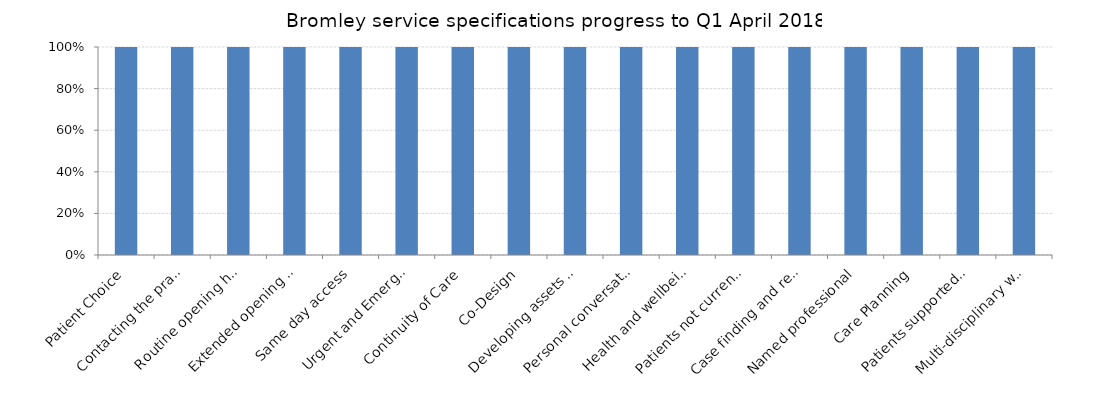
| Category | Series 0 |
|---|---|
| Patient Choice | 1 |
| Contacting the practice | 1 |
| Routine opening hours | 1 |
| Extended opening hours | 1 |
| Same day access | 1 |
| Urgent and Emergency Care | 1 |
| Continuity of Care | 1 |
| Co-Design | 1 |
| Developing assets and resources for improving health and wellbeing | 1 |
| Personal conversations focussed on an individual's health goals | 1 |
| Health and wellbeing liaison and information | 1 |
| Patients not currently accessing primary care services | 1 |
| Case finding and review | 1 |
| Named professional | 1 |
| Care Planning | 1 |
| Patients supported to manage their health and wellbeing | 1 |
| Multi-disciplinary working | 1 |